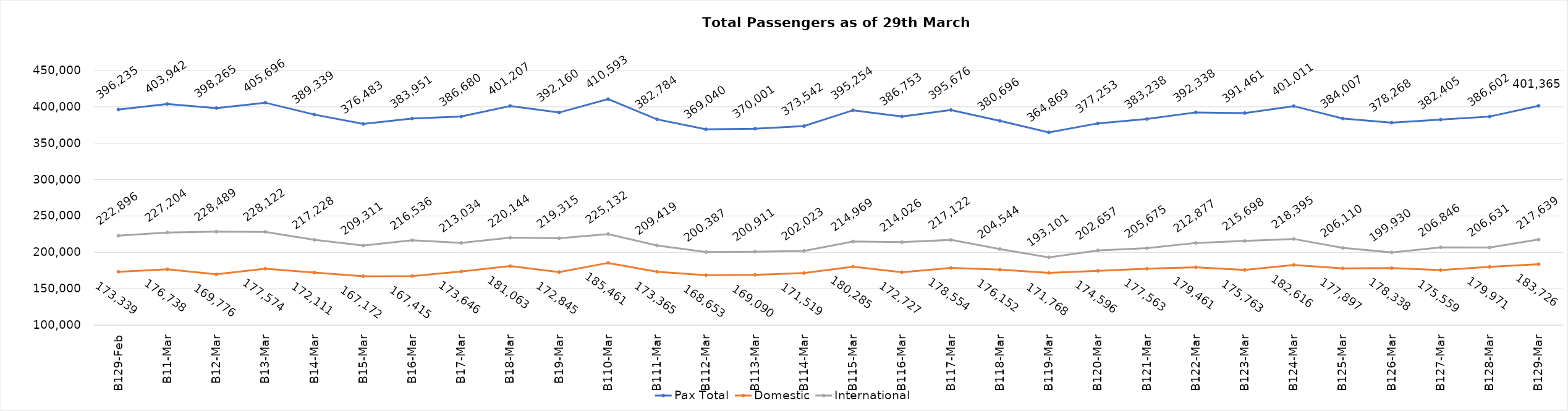
| Category | Pax Total | Domestic | International |
|---|---|---|---|
| 2024-02-29 | 396235 | 173339 | 222896 |
| 2024-03-01 | 403942 | 176738 | 227204 |
| 2024-03-02 | 398265 | 169776 | 228489 |
| 2024-03-03 | 405696 | 177574 | 228122 |
| 2024-03-04 | 389339 | 172111 | 217228 |
| 2024-03-05 | 376483 | 167172 | 209311 |
| 2024-03-06 | 383951 | 167415 | 216536 |
| 2024-03-07 | 386680 | 173646 | 213034 |
| 2024-03-08 | 401207 | 181063 | 220144 |
| 2024-03-09 | 392160 | 172845 | 219315 |
| 2024-03-10 | 410593 | 185461 | 225132 |
| 2024-03-11 | 382784 | 173365 | 209419 |
| 2024-03-12 | 369040 | 168653 | 200387 |
| 2024-03-13 | 370001 | 169090 | 200911 |
| 2024-03-14 | 373542 | 171519 | 202023 |
| 2024-03-15 | 395254 | 180285 | 214969 |
| 2024-03-16 | 386753 | 172727 | 214026 |
| 2024-03-17 | 395676 | 178554 | 217122 |
| 2024-03-18 | 380696 | 176152 | 204544 |
| 2024-03-19 | 364869 | 171768 | 193101 |
| 2024-03-20 | 377253 | 174596 | 202657 |
| 2024-03-21 | 383238 | 177563 | 205675 |
| 2024-03-22 | 392338 | 179461 | 212877 |
| 2024-03-23 | 391461 | 175763 | 215698 |
| 2024-03-24 | 401011 | 182616 | 218395 |
| 2024-03-25 | 384007 | 177897 | 206110 |
| 2024-03-26 | 378268 | 178338 | 199930 |
| 2024-03-27 | 382405 | 175559 | 206846 |
| 2024-03-28 | 386602 | 179971 | 206631 |
| 2024-03-29 | 401365 | 183726 | 217639 |